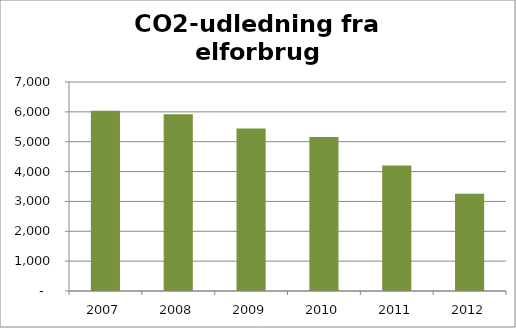
| Category | Ton CO2 |
|---|---|
| 2007.0 | 6039.465 |
| 2008.0 | 5917.512 |
| 2009.0 | 5444.617 |
| 2010.0 | 5157.503 |
| 2011.0 | 4203.283 |
| 2012.0 | 3258.48 |